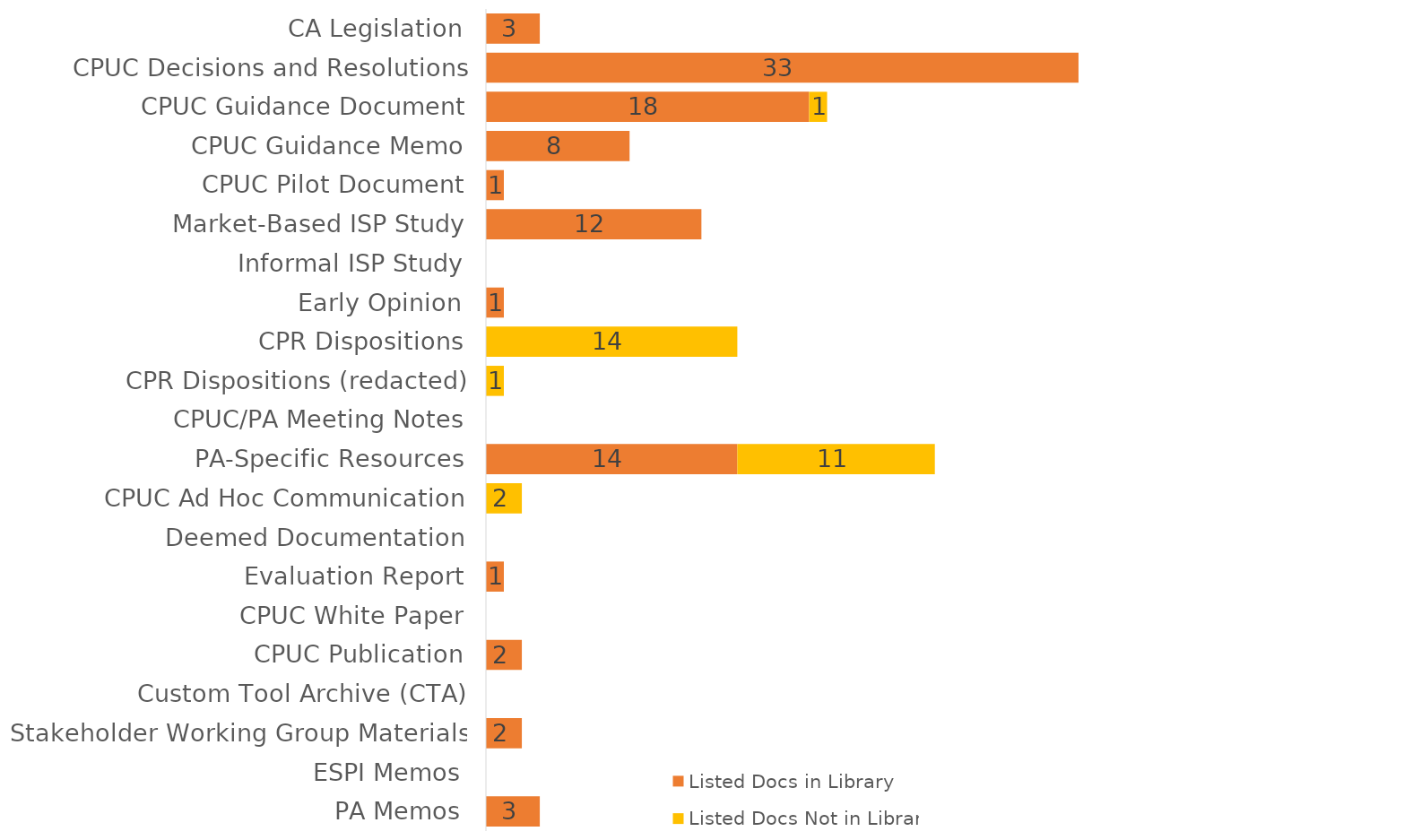
| Category | Listed Docs in Library | Listed Docs Not in Library |
|---|---|---|
| CA Legislation | 3 | 0 |
| CPUC Decisions and Resolutions | 33 | 0 |
| CPUC Guidance Document | 18 | 1 |
| CPUC Guidance Memo | 8 | 0 |
| CPUC Pilot Document | 1 | 0 |
| Market-Based ISP Study | 12 | 0 |
| Informal ISP Study | 0 | 0 |
| Early Opinion | 1 | 0 |
| CPR Dispositions | 0 | 14 |
| CPR Dispositions (redacted) | 0 | 1 |
| CPUC/PA Meeting Notes | 0 | 0 |
| PA-Specific Resources | 14 | 11 |
| CPUC Ad Hoc Communication | 0 | 2 |
| Deemed Documentation | 0 | 0 |
| Evaluation Report | 1 | 0 |
| CPUC White Paper | 0 | 0 |
| CPUC Publication | 2 | 0 |
| Custom Tool Archive (CTA) | 0 | 0 |
| Stakeholder Working Group Materials | 2 | 0 |
| ESPI Memos | 0 | 0 |
| PA Memos | 3 | 0 |